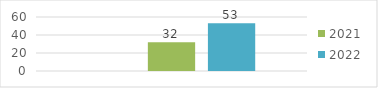
| Category | Julio - Septimebre | 2021 | 2022 |
|---|---|---|---|
| 0 |  | 32 | 53 |